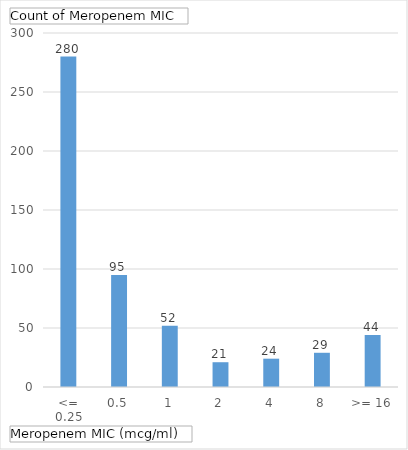
| Category | Total |
|---|---|
| <= 0.25 | 280 |
| 0.5 | 95 |
| 1 | 52 |
| 2 | 21 |
| 4 | 24 |
| 8 | 29 |
| >= 16 | 44 |